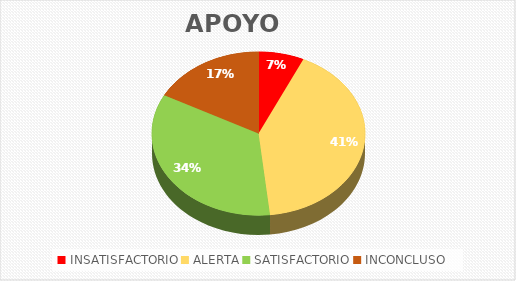
| Category | APOYO |
|---|---|
| INSATISFACTORIO | 2 |
| ALERTA | 12 |
| SATISFACTORIO | 10 |
| INCONCLUSO | 5 |